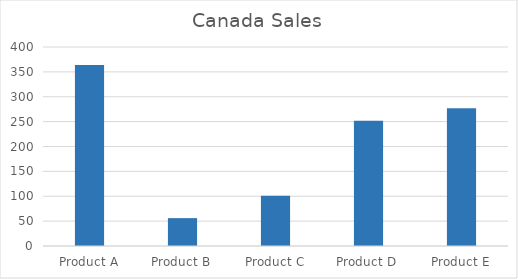
| Category | Paris |
|---|---|
| Product A | 364 |
| Product B | 56 |
| Product C | 101 |
| Product D | 252 |
| Product E | 277 |